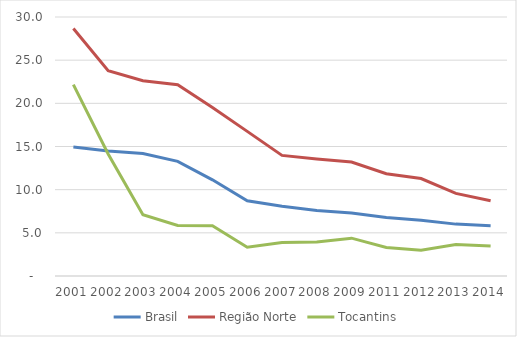
| Category | Brasil | Região Norte | Tocantins |
|---|---|---|---|
| 2001.0 | 14.955 | 28.66 | 22.175 |
| 2002.0 | 14.475 | 23.779 | 14.139 |
| 2003.0 | 14.19 | 22.619 | 7.099 |
| 2004.0 | 13.285 | 22.145 | 5.844 |
| 2005.0 | 11.14 | 19.518 | 5.82 |
| 2006.0 | 8.721 | 16.753 | 3.337 |
| 2007.0 | 8.08 | 13.97 | 3.867 |
| 2008.0 | 7.593 | 13.543 | 3.934 |
| 2009.0 | 7.309 | 13.198 | 4.381 |
| 2011.0 | 6.776 | 11.848 | 3.297 |
| 2012.0 | 6.452 | 11.29 | 2.988 |
| 2013.0 | 6.009 | 9.568 | 3.645 |
| 2014.0 | 5.816 | 8.718 | 3.472 |